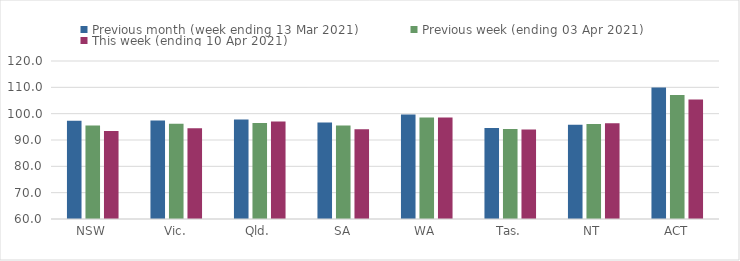
| Category | Previous month (week ending 13 Mar 2021) | Previous week (ending 03 Apr 2021) | This week (ending 10 Apr 2021) |
|---|---|---|---|
| NSW | 97.34 | 95.48 | 93.45 |
| Vic. | 97.42 | 96.16 | 94.46 |
| Qld. | 97.8 | 96.41 | 97 |
| SA | 96.65 | 95.55 | 94.04 |
| WA | 99.7 | 98.59 | 98.51 |
| Tas. | 94.53 | 94.14 | 94.01 |
| NT | 95.8 | 96.03 | 96.33 |
| ACT | 109.96 | 107.06 | 105.4 |